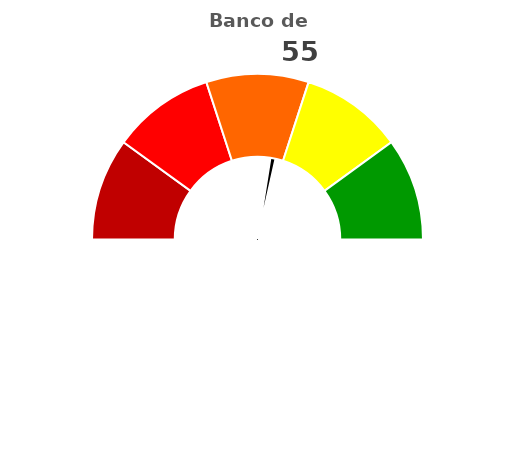
| Category | refe |
|---|---|
| 0 | 55 |
| 1 | 2 |
| 2 | 143 |